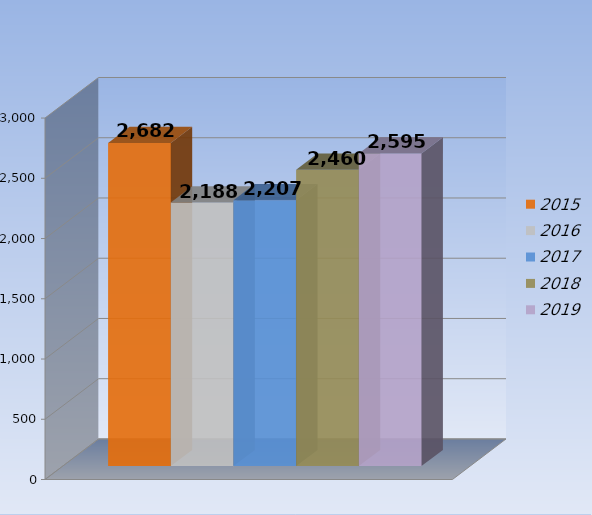
| Category | 2015 | 2016 | 2017 | 2018 | 2019 |
|---|---|---|---|---|---|
| 0 | 2682 | 2188 | 2207 | 2460 | 2595 |